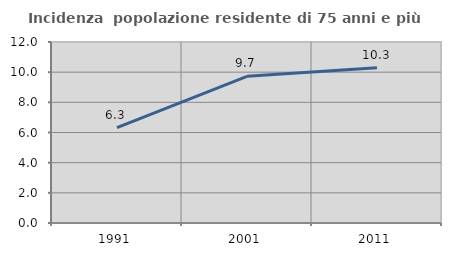
| Category | Incidenza  popolazione residente di 75 anni e più |
|---|---|
| 1991.0 | 6.32 |
| 2001.0 | 9.727 |
| 2011.0 | 10.293 |